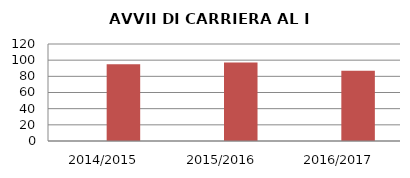
| Category | ANNO | NUMERO |
|---|---|---|
| 2014/2015 | 0 | 95 |
| 2015/2016 | 0 | 97 |
| 2016/2017 | 0 | 87 |